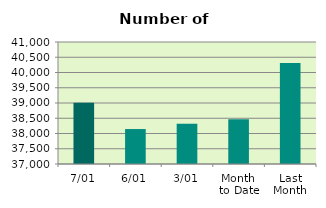
| Category | Series 0 |
|---|---|
| 7/01 | 39008 |
| 6/01 | 38146 |
| 3/01 | 38320 |
| Month 
to Date | 38469 |
| Last
Month | 40313.8 |